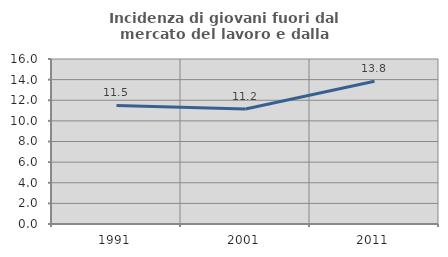
| Category | Incidenza di giovani fuori dal mercato del lavoro e dalla formazione  |
|---|---|
| 1991.0 | 11.502 |
| 2001.0 | 11.159 |
| 2011.0 | 13.846 |